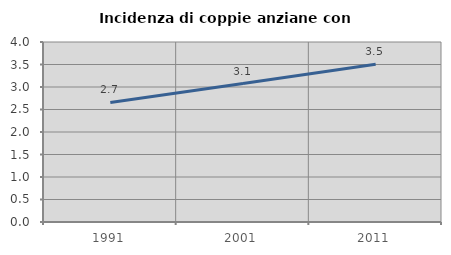
| Category | Incidenza di coppie anziane con figli |
|---|---|
| 1991.0 | 2.657 |
| 2001.0 | 3.075 |
| 2011.0 | 3.505 |